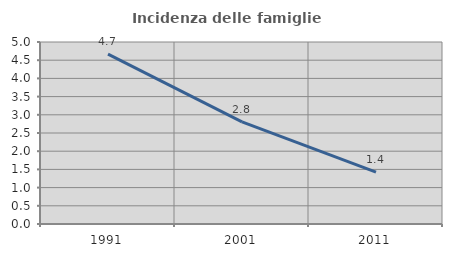
| Category | Incidenza delle famiglie numerose |
|---|---|
| 1991.0 | 4.667 |
| 2001.0 | 2.804 |
| 2011.0 | 1.423 |